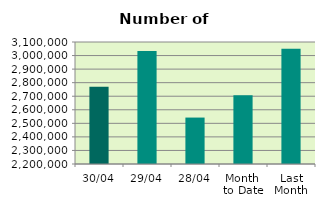
| Category | Series 0 |
|---|---|
| 30/04 | 2770494 |
| 29/04 | 3033546 |
| 28/04 | 2542564 |
| Month 
to Date | 2707305.9 |
| Last
Month | 3050763.217 |